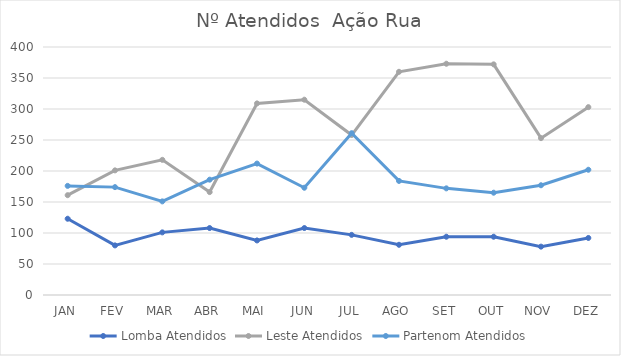
| Category | Lomba | Leste | Partenom |
|---|---|---|---|
| JAN | 123 | 161 | 176 |
| FEV | 80 | 201 | 174 |
| MAR | 101 | 218 | 151 |
| ABR | 108 | 166 | 186 |
| MAI | 88 | 309 | 212 |
| JUN | 108 | 315 | 173 |
| JUL | 97 | 258 | 261 |
| AGO | 81 | 360 | 184 |
| SET | 94 | 373 | 172 |
| OUT | 94 | 372 | 165 |
| NOV | 78 | 253 | 177 |
| DEZ | 92 | 303 | 202 |